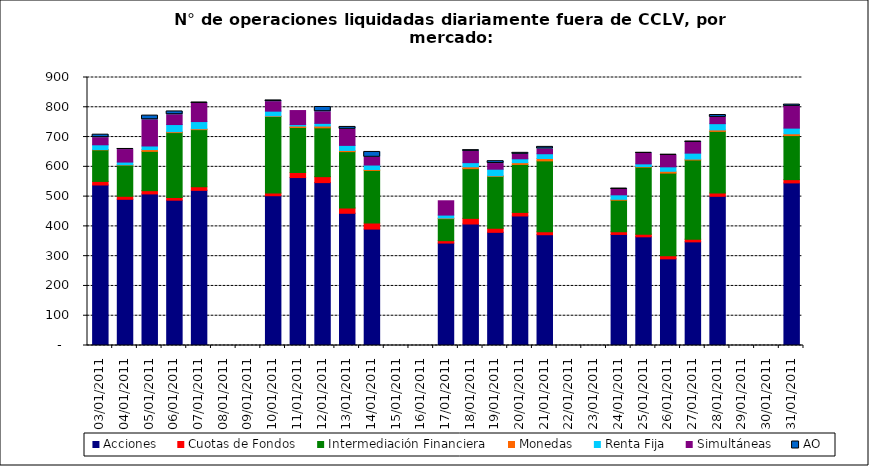
| Category | Acciones | Cuotas de Fondos | Intermediación Financiera | Monedas | Renta Fija | Simultáneas | AO |
|---|---|---|---|---|---|---|---|
| 03/01/2011 | 539 | 12 | 106 | 1 | 16 | 24 | 10 |
| 04/01/2011 | 491 | 10 | 105 | 1 | 9 | 42 | 2 |
| 05/01/2011 | 509 | 11 | 132 | 6 | 12 | 88 | 14 |
| 06/01/2011 | 488 | 9 | 218 | 3 | 24 | 33 | 11 |
| 07/01/2011 | 521 | 12 | 192 | 3 | 24 | 61 | 3 |
| 10/01/2011 | 503 | 9 | 257 | 2 | 16 | 32 | 4 |
| 11/01/2011 | 564 | 17 | 151 | 5 | 5 | 47 | 0 |
| 12/01/2011 | 547 | 20 | 164 | 6 | 9 | 39 | 16 |
| 13/01/2011 | 444 | 18 | 189 | 4 | 17 | 54 | 8 |
| 14/01/2011 | 391 | 20 | 177 | 3 | 15 | 26 | 18 |
| 17/01/2011 | 344 | 8 | 74 | 2 | 10 | 48 | 0 |
| 18/01/2011 | 408 | 19 | 167 | 6 | 14 | 38 | 4 |
| 19/01/2011 | 380 | 14 | 174 | 2 | 22 | 19 | 8 |
| 20/01/2011 | 435 | 12 | 161 | 6 | 13 | 15 | 5 |
| 21/01/2011 | 372 | 10 | 238 | 8 | 16 | 16 | 7 |
| 24/01/2011 | 373 | 9 | 106 | 3 | 15 | 18 | 3 |
| 25/01/2011 | 365 | 9 | 225 | 2 | 9 | 35 | 2 |
| 26/01/2011 | 291 | 10 | 278 | 6 | 15 | 39 | 1 |
| 27/01/2011 | 348 | 9 | 266 | 3 | 20 | 36 | 3 |
| 28/01/2011 | 501 | 11 | 207 | 5 | 21 | 21 | 8 |
| 31/01/2011 | 546 | 11 | 148 | 6 | 19 | 73 | 6 |